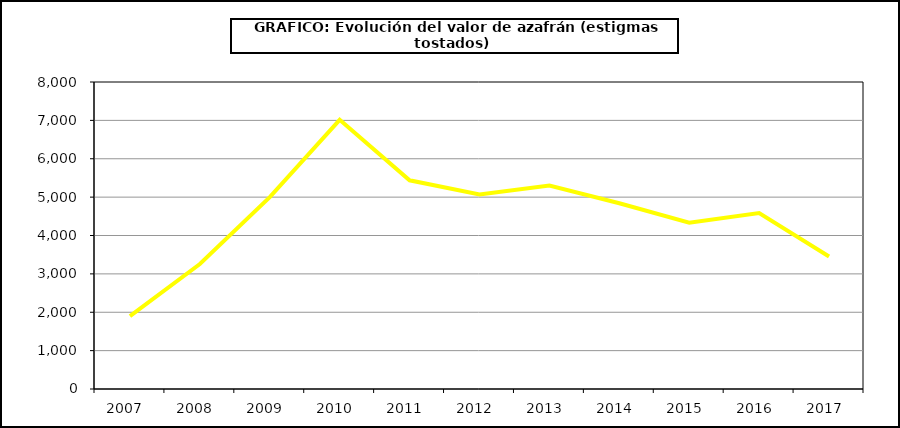
| Category | Valor |
|---|---|
| 2007.0 | 1898.858 |
| 2008.0 | 3257.208 |
| 2009.0 | 5000.541 |
| 2010.0 | 7014.469 |
| 2011.0 | 5438.177 |
| 2012.0 | 5071.99 |
| 2013.0 | 5302.253 |
| 2014.0 | 4841.325 |
| 2015.0 | 4331 |
| 2016.0 | 4587 |
| 2017.0 | 3451.991 |